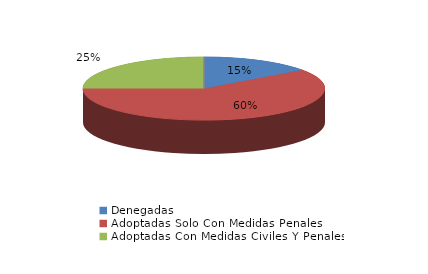
| Category | Series 0 |
|---|---|
| Denegadas | 3 |
| Adoptadas Solo Con Medidas Penales | 12 |
| Adoptadas Con Medidas Civiles Y Penales | 5 |
| Adoptadas Con Medidas Solo Civiles | 0 |